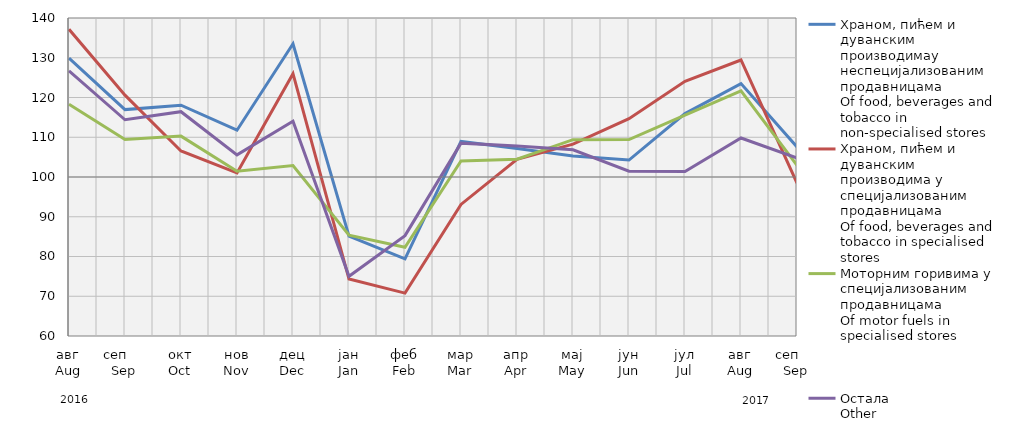
| Category | Храном, пићем и дуванским производимау неспецијализованим продавницама
Of food, beverages and tobacco in non-specialised stores
 | Храном, пићем и дуванским производима у специјализовaним продавницама
Of food, beverages and tobacco in specialised stores | Моторним горивима у специјализованим продавницама
Of motor fuels in specialised stores | Остала
Other |
|---|---|---|---|---|
| авг
Aug | 129.897 | 137.173 | 118.321 | 126.728 |
| сеп     Sep | 116.954 | 120.599 | 109.459 | 114.395 |
| окт
Oct | 118.057 | 106.539 | 110.286 | 116.429 |
| нов
Nov | 111.772 | 101.038 | 101.435 | 105.563 |
| дец
Dec | 133.518 | 125.992 | 102.88 | 114.01 |
| јан
Jan | 85.099 | 74.328 | 85.371 | 75.02 |
| феб
Feb | 79.418 | 70.792 | 82.332 | 85.25 |
| мар
Mar | 108.958 | 93.097 | 104.046 | 108.518 |
| апр
Apr | 107.187 | 104.456 | 104.458 | 107.78 |
| мај
May | 105.292 | 108.265 | 109.385 | 106.843 |
| јун
Jun | 104.266 | 114.686 | 109.425 | 101.464 |
| јул
Jul | 115.952 | 124.078 | 115.551 | 101.353 |
| авг
Aug | 123.494 | 129.435 | 121.673 | 109.807 |
| сеп     Sep | 107.568 | 98.457 | 102.908 | 104.789 |